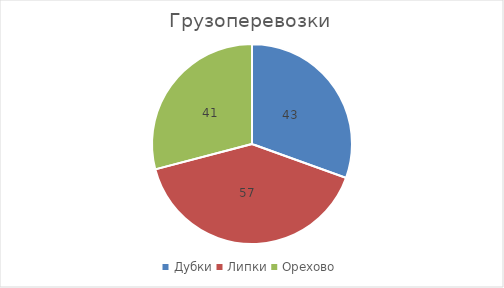
| Category | Series 0 |
|---|---|
| Дубки | 43 |
| Липки | 57 |
| Орехово | 41 |